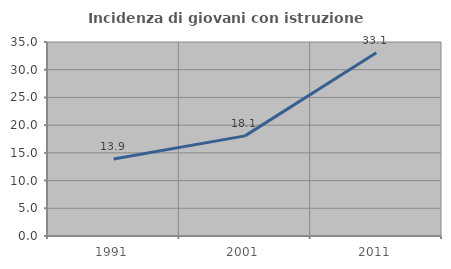
| Category | Incidenza di giovani con istruzione universitaria |
|---|---|
| 1991.0 | 13.886 |
| 2001.0 | 18.063 |
| 2011.0 | 33.066 |